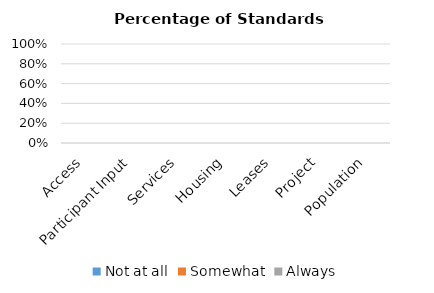
| Category | Not at all | Somewhat | Always |
|---|---|---|---|
| Access | 0 | 0 | 0 |
| Participant Input | 0 | 0 | 0 |
| Services | 0 | 0 | 0 |
| Housing | 0 | 0 | 0 |
| Leases | 0 | 0 | 0 |
| Project | 0 | 0 | 0 |
| Population | 0 | 0 | 0 |